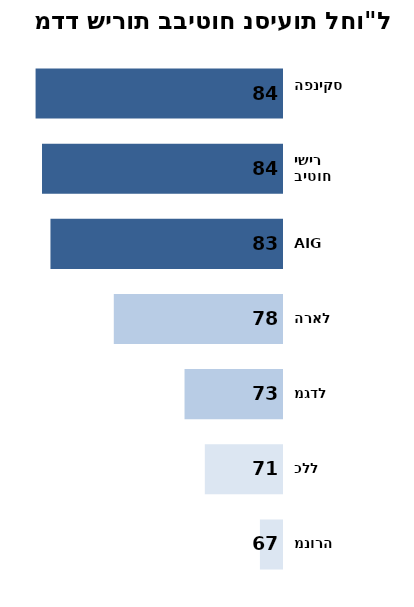
| Category | Series 0 |
|---|---|
| הפניקס | 84.309 |
| ביטוח ישיר | 83.806 |
| AIG | 83.143 |
| הראל | 78.18 |
| מגדל | 72.637 |
| כלל | 71.047 |
| מנורה | 66.729 |